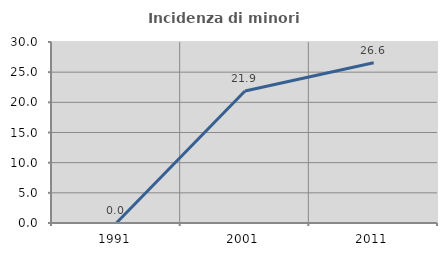
| Category | Incidenza di minori stranieri |
|---|---|
| 1991.0 | 0 |
| 2001.0 | 21.875 |
| 2011.0 | 26.562 |